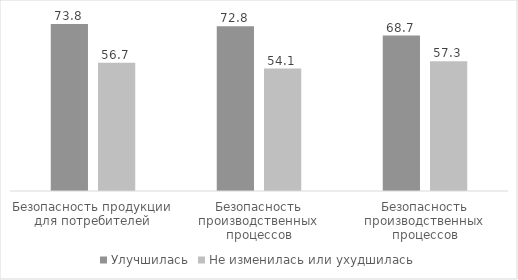
| Category | Улучшилась | Не изменилась или ухудшилась |
|---|---|---|
| Безопасность продукции для потребителей | 73.8 | 56.7 |
| Безопасность производственных процессов | 72.8 | 54.1 |
| Безопасность производственных процессов | 68.7 | 57.3 |